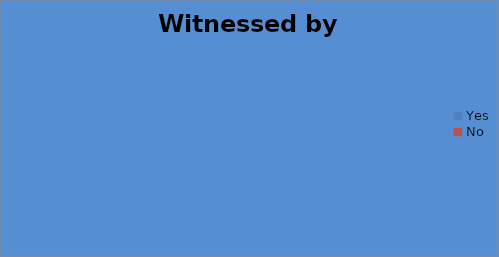
| Category | Witnessed by EMS |
|---|---|
| Yes | 0 |
| No | 0 |